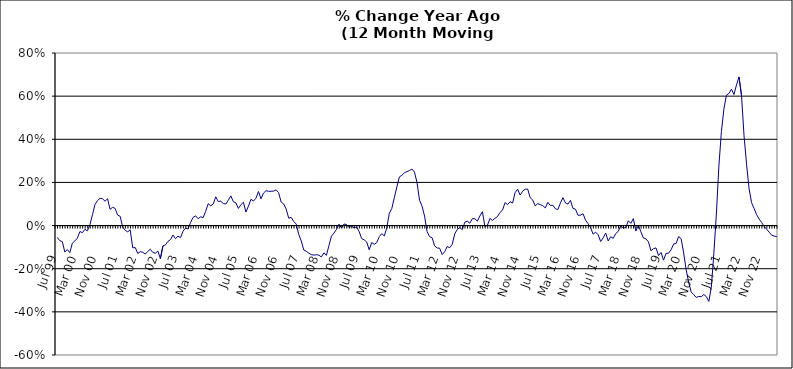
| Category | Series 0 |
|---|---|
| Jul 99 | -0.055 |
| Aug 99 | -0.07 |
| Sep 99 | -0.074 |
| Oct 99 | -0.123 |
| Nov 99 | -0.111 |
| Dec 99 | -0.125 |
| Jan 00 | -0.082 |
| Feb 00 | -0.071 |
| Mar 00 | -0.058 |
| Apr 00 | -0.027 |
| May 00 | -0.033 |
| Jun 00 | -0.017 |
| Jul 00 | -0.025 |
| Aug 00 | 0.005 |
| Sep 00 | 0.05 |
| Oct 00 | 0.098 |
| Nov 00 | 0.116 |
| Dec 00 | 0.127 |
| Jan 01 | 0.124 |
| Feb 01 | 0.113 |
| Mar 01 | 0.124 |
| Apr 01 | 0.075 |
| May 01 | 0.085 |
| Jun 01 | 0.08 |
| Jul 01 | 0.048 |
| Aug 01 | 0.043 |
| Sep 01 | -0.007 |
| Oct 01 | -0.022 |
| Nov 01 | -0.029 |
| Dec 01 | -0.02 |
| Jan 02 | -0.103 |
| Feb 02 | -0.102 |
| Mar 02 | -0.129 |
| Apr 02 | -0.121 |
| May 02 | -0.124 |
| Jun 02 | -0.132 |
| Jul 02 | -0.119 |
| Aug 02 | -0.11 |
| Sep 02 | -0.125 |
| Oct 02 | -0.128 |
| Nov 02 | -0.118 |
| Dec 02 | -0.153 |
| Jan 03 | -0.094 |
| Feb 03 | -0.09 |
| Mar 03 | -0.073 |
| Apr 03 | -0.065 |
| May 03 | -0.044 |
| Jun 03 | -0.06 |
| Jul 03 | -0.049 |
| Aug 03 | -0.056 |
| Sep 03 | -0.026 |
| Oct 03 | -0.012 |
| Nov 03 | -0.016 |
| Dec 03 | 0.014 |
| Jan 04 | 0.038 |
| Feb 04 | 0.045 |
| Mar 04 | 0.032 |
| Apr 04 | 0.041 |
| May 04 | 0.037 |
| Jun 04 | 0.066 |
| Jul 04 | 0.101 |
| Aug 04 | 0.092 |
| Sep 04 | 0.1 |
| Oct 04 | 0.133 |
| Nov 04 | 0.111 |
| Dec 04 | 0.113 |
| Jan 05 | 0.103 |
| Feb 05 | 0.1 |
| Mar 05 | 0.118 |
| Apr 05 | 0.138 |
| May 05 | 0.11 |
| Jun 05 | 0.106 |
| Jul 05 | 0.079 |
| Aug 05 | 0.097 |
| Sep 05 | 0.108 |
| Oct 05 | 0.063 |
| Nov 05 | 0.09 |
| Dec 05 | 0.122 |
| Jan 06 | 0.114 |
| Feb 06 | 0.127 |
| Mar 06 | 0.158 |
| Apr 06 | 0.124 |
| May 06 | 0.151 |
| Jun 06 | 0.162 |
| Jul 06 | 0.159 |
| Aug 06 | 0.159 |
| Sep 06 | 0.16 |
| Oct 06 | 0.166 |
| Nov 06 | 0.152 |
| Dec 06 | 0.109 |
| Jan 07 | 0.101 |
| Feb 07 | 0.076 |
| Mar 07 | 0.034 |
| Apr 07 | 0.038 |
| May 07 | 0.019 |
| Jun 07 | 0.007 |
| Jul 07 | -0.041 |
| Aug 07 | -0.071 |
| Sep 07 | -0.113 |
| Oct 07 | -0.12 |
| Nov 07 | -0.128 |
| Dec 07 | -0.135 |
| Jan 08 | -0.137 |
| Feb 08 | -0.135 |
| Mar 08 | -0.137 |
| Apr 08 | -0.145 |
| May 08 | -0.126 |
| Jun 08 | -0.138 |
| Jul 08 | -0.093 |
| Aug 08 | -0.049 |
| Sep-08 | -0.035 |
| Oct 08 | -0.018 |
| Nov 08 | 0.007 |
| Dec 08 | -0.011 |
| Jan 09 | 0.007 |
| Feb 09 | 0.005 |
| Mar 09 | -0.009 |
| Apr 09 | -0.003 |
| May 09 | -0.01 |
| Jun 09 | -0.007 |
| Jul 09 | -0.027 |
| Aug 09 | -0.06 |
| Sep 09 | -0.066 |
| Oct 09 | -0.076 |
| Nov 09 | -0.112 |
| Dec 09 | -0.079 |
| Jan 10 | -0.087 |
| Feb 10 | -0.079 |
| Mar 10 | -0.052 |
| Apr 10 | -0.037 |
| May 10 | -0.048 |
| Jun 10 | -0.01 |
| Jul 10 | 0.057 |
| Aug 10 | 0.08 |
| Sep 10 | 0.13 |
| Oct 10 | 0.179 |
| Nov 10 | 0.226 |
| Dec 10 | 0.233 |
| Jan 11 | 0.245 |
| Feb 11 | 0.25 |
| Mar 11 | 0.255 |
| Apr 11 | 0.262 |
| May 11 | 0.248 |
| Jun 11 | 0.199 |
| Jul 11 | 0.118 |
| Aug 11 | 0.09 |
| Sep 11 | 0.044 |
| Oct 11 | -0.028 |
| Nov 11 | -0.051 |
| Dec 11 | -0.056 |
| Jan 12 | -0.094 |
| Feb 12 | -0.104 |
| Mar 12 | -0.105 |
| Apr 12 | -0.134 |
| May 12 | -0.121 |
| Jun 12 | -0.098 |
| Jul 12 | -0.103 |
| Aug 12 | -0.087 |
| Sep 12 | -0.038 |
| Oct 12 | -0.018 |
| Nov 12 | -0.009 |
| Dec 12 | -0.019 |
| Jan 13 | 0.016 |
| Feb-13 | 0.02 |
| Mar-13 | 0.011 |
| Apr 13 | 0.032 |
| May 13 | 0.032 |
| Jun-13 | 0.021 |
| Jul 13 | 0.045 |
| Aug 13 | 0.065 |
| Sep 13 | -0.005 |
| Oct 13 | 0.002 |
| Nov 13 | 0.033 |
| Dec 13 | 0.024 |
| Jan 14 | 0.034 |
| Feb-14 | 0.042 |
| Mar 14 | 0.061 |
| Apr 14 | 0.072 |
| May 14 | 0.107 |
| Jun 14 | 0.097 |
| Jul-14 | 0.111 |
| Aug-14 | 0.105 |
| Sep 14 | 0.153 |
| Oct 14 | 0.169 |
| Nov 14 | 0.141 |
| Dec 14 | 0.159 |
| Jan 15 | 0.169 |
| Feb 15 | 0.169 |
| Mar 15 | 0.129 |
| Apr-15 | 0.118 |
| May 15 | 0.091 |
| Jun-15 | 0.102 |
| Jul 15 | 0.097 |
| Aug 15 | 0.092 |
| Sep 15 | 0.082 |
| Oct 15 | 0.108 |
| Nov 15 | 0.093 |
| Dec 15 | 0.094 |
| Jan 16 | 0.078 |
| Feb 16 | 0.075 |
| Mar 16 | 0.104 |
| Apr 16 | 0.129 |
| May 16 | 0.105 |
| Jun 16 | 0.1 |
| Jul 16 | 0.117 |
| Aug 16 | 0.08 |
| Sep 16 | 0.076 |
| Oct 16 | 0.048 |
| Nov 16 | 0.048 |
| Dec 16 | 0.055 |
| Jan 17 | 0.025 |
| Feb 17 | 0.009 |
| Mar 17 | -0.01 |
| Apr 17 | -0.04 |
| May 17 | -0.031 |
| Jun 17 | -0.042 |
| Jul 17 | -0.074 |
| Aug 17 | -0.057 |
| Sep 17 | -0.035 |
| Oct 17 | -0.071 |
| Nov 17 | -0.052 |
| Dec 17 | -0.059 |
| Jan 18 | -0.037 |
| Feb 18 | -0.027 |
| Mar 18 | 0 |
| Apr 18 | -0.012 |
| May 18 | -0.009 |
| Jun 18 | 0.022 |
| Jul 18 | 0.01 |
| Aug 18 | 0.033 |
| Sep 18 | -0.025 |
| Oct 18 | 0.002 |
| Nov 18 | -0.029 |
| Dec 18 | -0.058 |
| Jan 19 | -0.061 |
| Feb 19 | -0.075 |
| Mar 19 | -0.117 |
| Apr 19 | -0.107 |
| May 19 | -0.104 |
| Jun 19 | -0.139 |
| Jul 19 | -0.124 |
| Aug 19 | -0.16 |
| Sep 19 | -0.129 |
| Oct 19 | -0.128 |
| Nov 19 | -0.112 |
| Dec 19 | -0.085 |
| Jan 20 | -0.083 |
| Feb 20 | -0.051 |
| Mar 20 | -0.061 |
| Apr 20 | -0.127 |
| May 20 | -0.206 |
| Jun 20 | -0.264 |
| Jul 20 | -0.308 |
| Aug 20 | -0.32 |
| Sep 20 | -0.333 |
| Oct 20 | -0.329 |
| Nov 20 | -0.33 |
| Dec 20 | -0.319 |
| Jan 21 | -0.329 |
| Feb 21 | -0.352 |
| Mar 21 | -0.286 |
| Apr 21 | -0.129 |
| May 21 | 0.053 |
| Jun 21 | 0.276 |
| Jul 21 | 0.435 |
| Aug 21 | 0.541 |
| Sep 21 | 0.604 |
| Oct 21 | 0.613 |
| Nov 21 | 0.632 |
| Dec 21 | 0.608 |
| Jan 22 | 0.652 |
| Feb 22 | 0.689 |
| Mar 22 | 0.603 |
| Apr 22 | 0.416 |
| May 22 | 0.285 |
| Jun 22 | 0.171 |
| Jul 22 | 0.106 |
| Aug 22 | 0.079 |
| Sep 22 | 0.051 |
| Oct 22 | 0.03 |
| Nov 22 | 0.014 |
| Dec 22 | -0.004 |
| Jan 23 | -0.017 |
| Feb 23 | -0.031 |
| Mar 23 | -0.045 |
| Apr 23 | -0.049 |
| May 23 | -0.051 |